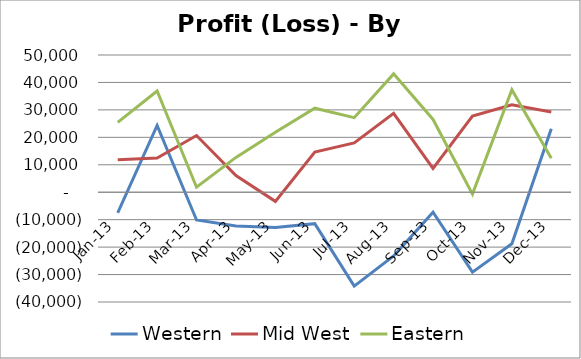
| Category | Western | Mid West | Eastern |
|---|---|---|---|
| 2013-01-31 | -7483 | 11815 | 25462 |
| 2013-02-28 | 24320 | 12425 | 36876 |
| 2013-03-31 | -10125 | 20642 | 1819 |
| 2013-04-30 | -12276 | 6047 | 12693 |
| 2013-05-31 | -12832 | -3335 | 21852 |
| 2013-06-30 | -11452 | 14652 | 30610 |
| 2013-07-31 | -34202 | 17960 | 27161 |
| 2013-08-31 | -23205 | 28722 | 43119 |
| 2013-09-30 | -7258 | 8678 | 26508 |
| 2013-10-31 | -29127 | 27748 | -690 |
| 2013-11-30 | -18770 | 31875 | 37345 |
| 2013-12-31 | 23117 | 29215 | 12421 |